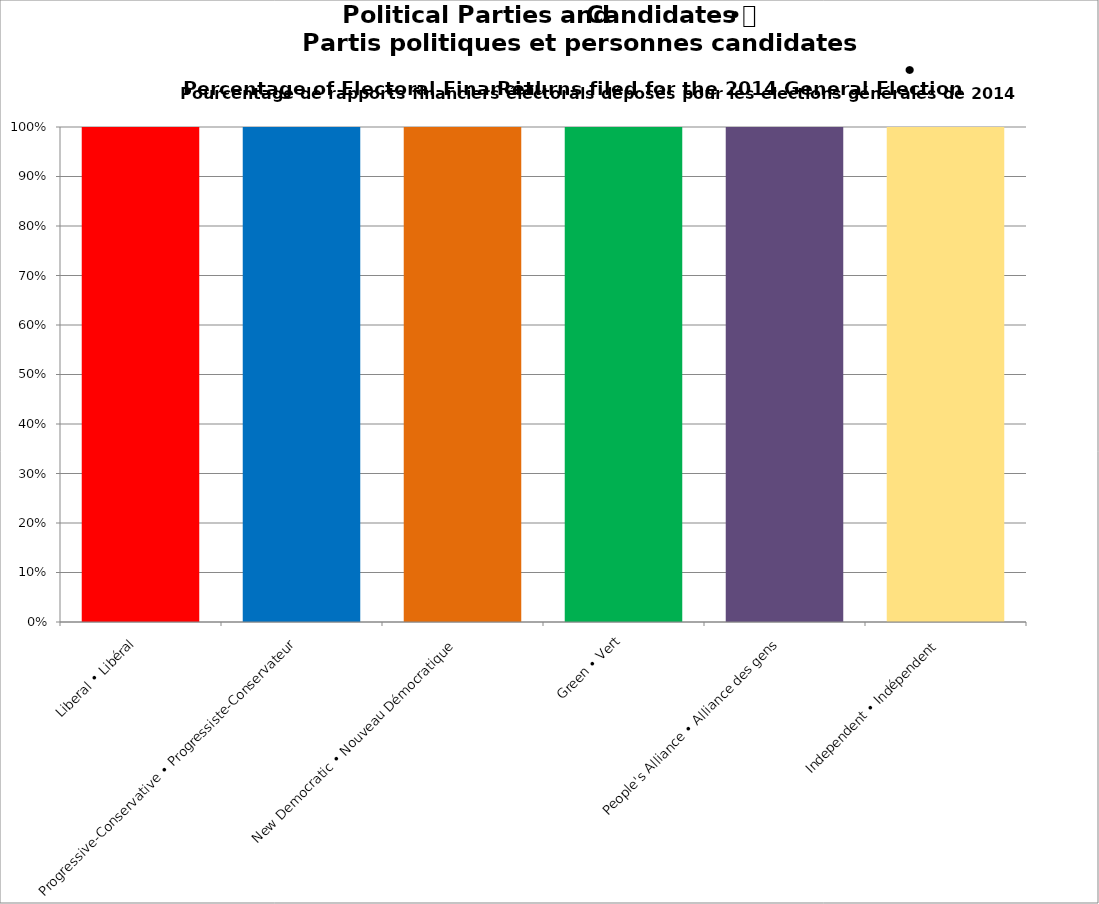
| Category | Series 0 | Series 2 | Series 4 |
|---|---|---|---|
| Liberal • Libéral | 1 |  |  |
| Progressive-Conservative • Progressiste-Conservateur | 1 |  |  |
| New Democratic • Nouveau Démocratique | 1 |  |  |
| Green • Vert | 1 |  |  |
| People's Alliance • Alliance des gens | 1 |  |  |
| Independent • Indépendent | 1 |  |  |